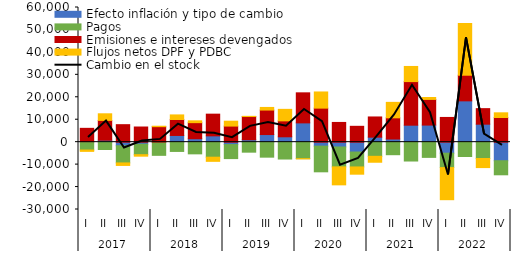
| Category | Efecto inflación y tipo de cambio | Pagos | Emisiones e intereses devengados | Flujos netos DPF y PDBC |
|---|---|---|---|---|
| 0 | 249.031 | -3509.886 | 5912.018 | -589.335 |
| 1 | 883.089 | -3263.186 | 8819.471 | 2939.674 |
| 2 | -1599.072 | -7648.803 | 7796.025 | -1118.992 |
| 3 | -925.513 | -4651.23 | 6753.997 | -669.093 |
| 4 | 74.033 | -5868.511 | 6831.404 | 196.159 |
| 5 | 2986.431 | -4130.451 | 7102.886 | 2052.23 |
| 6 | 1534.185 | -5206.718 | 7157.321 | 810.157 |
| 7 | 2813.997 | -6696.323 | 9665.546 | -1845.922 |
| 8 | -1081.038 | -6236.886 | 7168.647 | 2177.738 |
| 9 | 1089.383 | -4457.429 | 10331.382 | 83.583 |
| 10 | 3390.141 | -6682.678 | 10915.32 | 1167.81 |
| 11 | 2392.044 | -7511.642 | 7099.585 | 5128.415 |
| 12 | 8594.081 | -7343.784 | 13384.622 | -97.902 |
| 13 | -1772.001 | -11438.54 | 15163.434 | 7201.179 |
| 14 | -2149.311 | -8858.713 | 8788.336 | -8008.589 |
| 15 | -4395.416 | -6644.683 | 7062.95 | -3227.934 |
| 16 | 2222.966 | -6309.067 | 9007.04 | -2636.876 |
| 17 | 1404.321 | -5585.786 | 9441.64 | 6887.533 |
| 18 | 7563.642 | -8399.143 | 19426.312 | 6739.781 |
| 19 | 7609.534 | -6776.988 | 11435.339 | 844.951 |
| 20 | -4915.596 | -6416.317 | 11014.745 | -14297.959 |
| 21 | 18406.55 | -6392.708 | 11423.347 | 23037.678 |
| 22 | 8010.147 | -7267.821 | 6926.968 | -4056.009 |
| 23 | -8274.013 | -6263.751 | 10986.334 | 2088.564 |